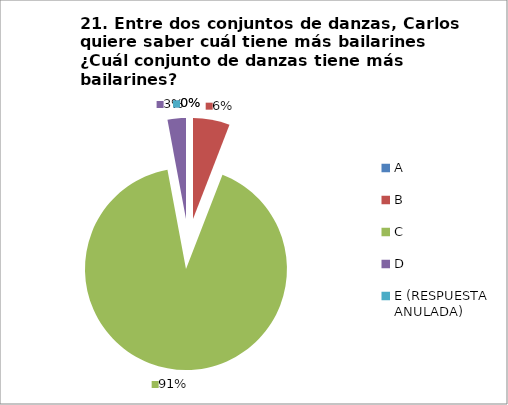
| Category | CANTIDAD DE RESPUESTAS PREGUNTA (21) | PORCENTAJE |
|---|---|---|
| A | 0 | 0 |
| B | 2 | 0.059 |
| C | 31 | 0.912 |
| D | 1 | 0.029 |
| E (RESPUESTA ANULADA) | 0 | 0 |